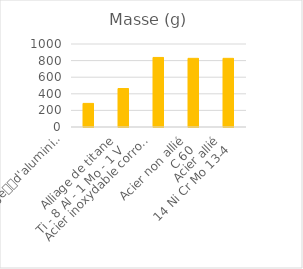
| Category | Series 0 |
|---|---|
| Alliage
d'aluminium
4032-T6
(Al Si 12,5 Mg Cu Ni) | 284.27 |
| Alliage de titane
Ti - 8 Al - 1 Mo - 1 V | 463.53 |
| Acier inoxydable corroyé
X6 Cr Ni Ti 18-10 | 837.96 |
| Acier non allié
C 60 | 827.36 |
| Acier allié
14 Ni Cr Mo 13-4 | 827.36 |